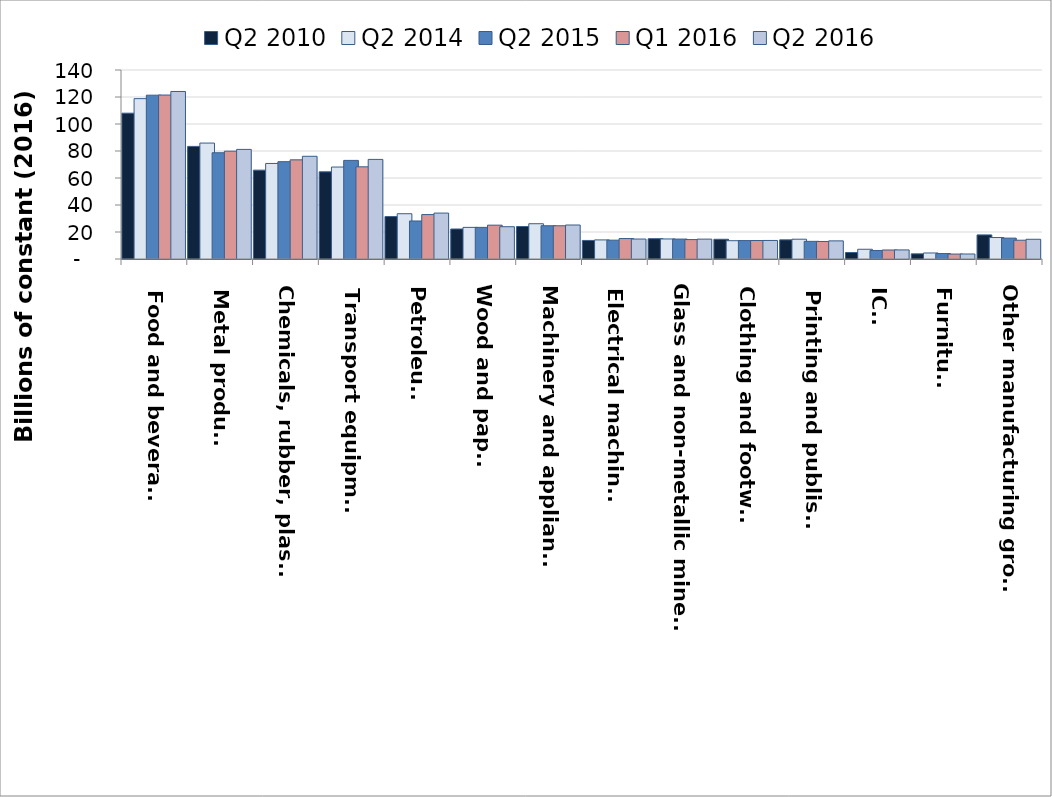
| Category | Q2 2010 | Q2 2014 | Q2 2015 | Q1 2016 | Q2 2016 |
|---|---|---|---|---|---|
| Food and beverages | 108.015 | 118.781 | 121.346 | 121.454 | 124.091 |
| Metal products | 83.405 | 85.872 | 78.712 | 79.864 | 81.184 |
| Chemicals, rubber, plastics | 65.827 | 70.781 | 72.088 | 73.459 | 76.08 |
| Transport equipment | 64.583 | 68.114 | 73.041 | 68.283 | 73.781 |
| Petroleum | 31.438 | 33.541 | 28.165 | 32.909 | 34.007 |
| Wood and paper | 22.221 | 23.424 | 23.415 | 25.064 | 23.922 |
| Machinery and appliances | 24.069 | 26.129 | 24.635 | 24.609 | 25.181 |
| Electrical machinery | 13.747 | 14.143 | 13.952 | 15.149 | 14.78 |
| Glass and non-metallic minerals | 15.041 | 14.847 | 14.757 | 14.383 | 14.732 |
| Clothing and footwear | 14.612 | 13.557 | 13.643 | 13.686 | 13.729 |
| Printing and publishing | 14.193 | 14.664 | 13.071 | 12.982 | 13.431 |
| ICT | 4.817 | 7.222 | 6.318 | 6.67 | 6.728 |
| Furniture | 3.823 | 4.465 | 4.028 | 3.661 | 3.713 |
| Other manufacturing groups | 17.837 | 15.894 | 15.474 | 13.917 | 14.615 |